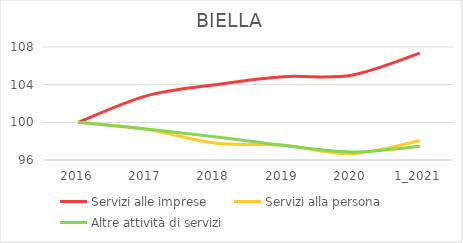
| Category | Servizi alle imprese | Servizi alla persona | Altre attività di servizi |
|---|---|---|---|
| 2016 | 100 | 100 | 100 |
| 2017 | 102.815 | 99.268 | 99.302 |
| 2018 | 103.987 | 97.805 | 98.477 |
| 2019 | 104.848 | 97.561 | 97.557 |
| 2020 | 105.004 | 96.667 | 96.859 |
| 1_2021 | 107.349 | 98.049 | 97.462 |